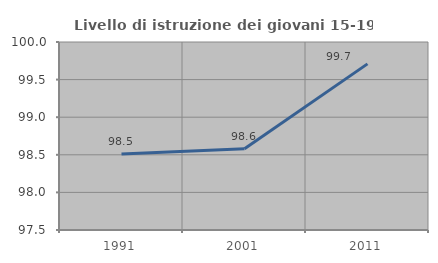
| Category | Livello di istruzione dei giovani 15-19 anni |
|---|---|
| 1991.0 | 98.511 |
| 2001.0 | 98.58 |
| 2011.0 | 99.709 |